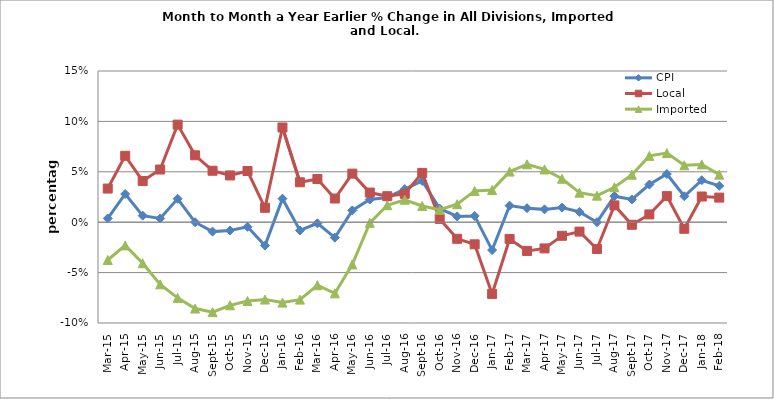
| Category | CPI | Local | Imported |
|---|---|---|---|
| 2015-03-02 | 0.004 | 0.033 | -0.037 |
| 2015-04-02 | 0.028 | 0.066 | -0.023 |
| 2015-05-01 | 0.007 | 0.041 | -0.041 |
| 2015-06-01 | 0.004 | 0.052 | -0.062 |
| 2015-07-01 | 0.023 | 0.097 | -0.075 |
| 2015-08-01 | 0 | 0.066 | -0.086 |
| 2015-09-01 | -0.009 | 0.051 | -0.089 |
| 2015-10-01 | -0.008 | 0.046 | -0.082 |
| 2015-11-01 | -0.005 | 0.051 | -0.078 |
| 2015-12-01 | -0.023 | 0.014 | -0.077 |
| 2016-01-01 | 0.023 | 0.094 | -0.08 |
| 2016-02-01 | -0.008 | 0.04 | -0.077 |
| 2016-03-01 | -0.001 | 0.043 | -0.063 |
| 2016-04-01 | -0.015 | 0.023 | -0.071 |
| 2016-05-01 | 0.012 | 0.048 | -0.042 |
| 2016-06-01 | 0.023 | 0.029 | -0.001 |
| 2016-07-01 | 0.025 | 0.026 | 0.017 |
| 2016-08-01 | 0.033 | 0.028 | 0.022 |
| 2016-09-01 | 0.041 | 0.049 | 0.016 |
| 2016-10-01 | 0.014 | 0.003 | 0.012 |
| 2016-11-01 | 0.006 | -0.016 | 0.018 |
| 2016-12-01 | 0.006 | -0.022 | 0.031 |
| 2017-01-01 | -0.028 | -0.071 | 0.032 |
| 2017-02-01 | 0.016 | -0.017 | 0.05 |
| 2017-03-01 | 0.014 | -0.029 | 0.057 |
| 2017-04-01 | 0.013 | -0.026 | 0.052 |
| 2017-05-01 | 0.015 | -0.013 | 0.043 |
| 2017-06-01 | 0.01 | -0.009 | 0.029 |
| 2017-07-01 | 0 | -0.027 | 0.026 |
| 2017-08-01 | 0.026 | 0.017 | 0.035 |
| 2017-09-01 | 0.023 | -0.003 | 0.047 |
| 2017-10-01 | 0.037 | 0.008 | 0.066 |
| 2017-11-01 | 0.048 | 0.026 | 0.069 |
| 2017-12-01 | 0.026 | -0.007 | 0.056 |
| 2018-01-01 | 0.042 | 0.025 | 0.057 |
| 2018-02-01 | 0.036 | 0.024 | 0.047 |